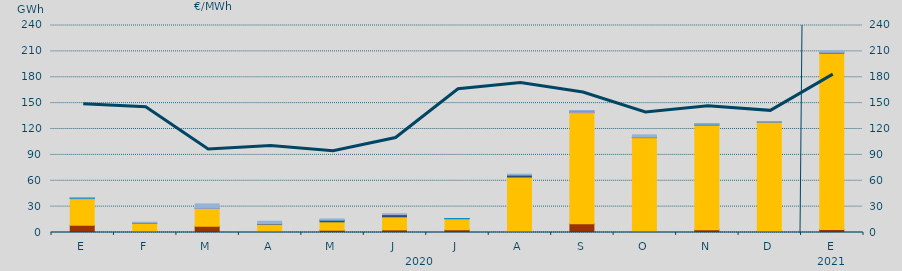
| Category | Carbón | Ciclo Combinado | Cogeneración | Consumo Bombeo | Enlace Península Baleares | Hidráulica | Turbinación bombeo |
|---|---|---|---|---|---|---|---|
| E | 8420 | 30910.7 | 0 | 268 | 0 | 577.4 | 42.2 |
| F | 555 | 10252.6 | 0 | 288.2 | 0 | 0 | 841.9 |
| M | 7260 | 20800.5 | 0 | 100 | 224 | 0 | 4781.4 |
| A | 0 | 9541.3 | 0 | 636 | 60 | 0 | 2816.9 |
| M | 2649.6 | 9736.2 | 0 | 1745.1 | 0 | 334.1 | 1316.2 |
| J | 3060 | 15134.9 | 0 | 2490.7 | 411.1 | 0 | 685.4 |
| J | 3178 | 12853.9 | 0 | 133.1 | 0 | 91.7 | 0 |
| A | 1050 | 63281 | 0 | 2200 | 0 | 188.1 | 916.7 |
| S | 10238 | 128800.8 | 0 | 57.3 | 1627 | 176.6 | 209.8 |
| O | 0 | 110024.3 | 0 | 262 | 0 | 225.4 | 2701.6 |
| N | 3145 | 121295.1 | 0 | 65.7 | 1107 | 146.6 | 192.5 |
| D | 720 | 127266.3 | 0 | 107.7 | 0 | 0 | 50 |
| E | 3491 | 204562.6 | 0 | 876.6 | 321.5 | 0 | 1674.7 |